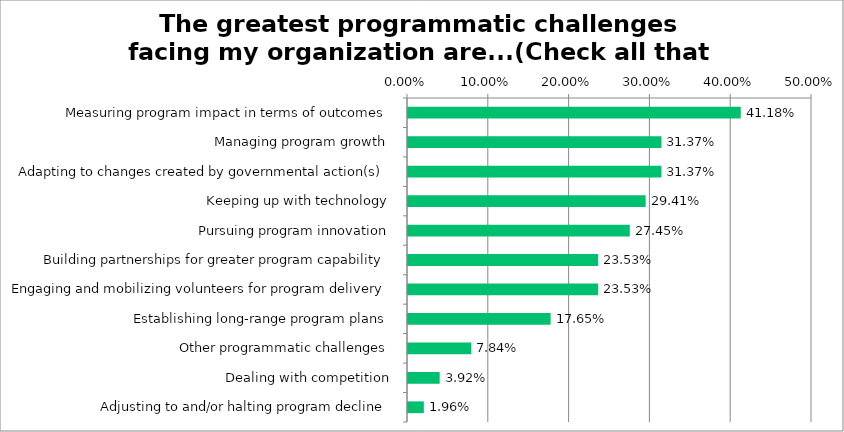
| Category | Responses |
|---|---|
| Measuring program impact in terms of outcomes | 0.412 |
| Managing program growth | 0.314 |
| Adapting to changes created by governmental action(s) | 0.314 |
| Keeping up with technology | 0.294 |
| Pursuing program innovation | 0.274 |
| Building partnerships for greater program capability | 0.235 |
| Engaging and mobilizing volunteers for program delivery | 0.235 |
| Establishing long-range program plans | 0.176 |
| Other programmatic challenges | 0.078 |
| Dealing with competition | 0.039 |
| Adjusting to and/or halting program decline | 0.02 |